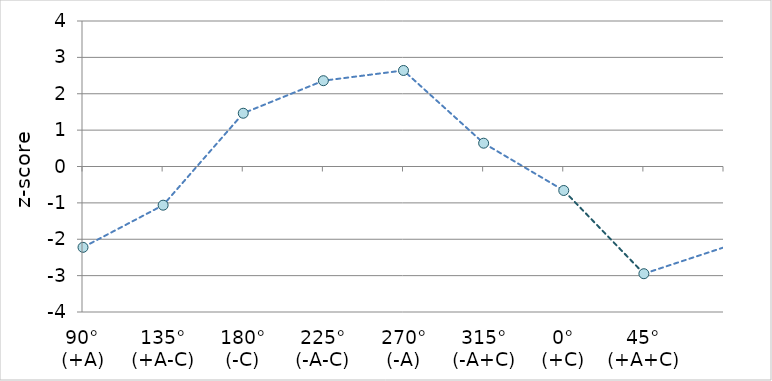
| Category | Z-scores |
|---|---|
| 90°
(+A) | -2.222 |
| 135°
(+A-C) | -1.063 |
| 180°
(-C) | 1.464 |
| 225°
(-A-C) | 2.359 |
| 270°
(-A) | 2.64 |
| 315°
(-A+C) | 0.641 |
| 0°
(+C) | -0.659 |
| 45°
(+A+C) | -2.947 |